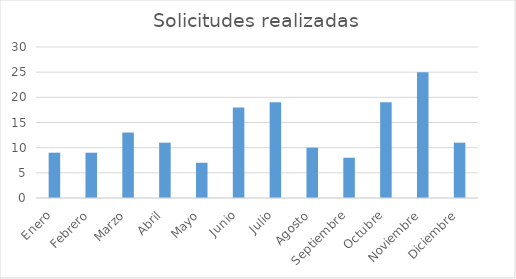
| Category | Solicitudes realizadas |
|---|---|
| Enero | 9 |
| Febrero | 9 |
| Marzo | 13 |
| Abril | 11 |
| Mayo | 7 |
| Junio | 18 |
| Julio | 19 |
| Agosto | 10 |
| Septiembre | 8 |
| Octubre | 19 |
| Noviembre | 25 |
| Diciembre | 11 |